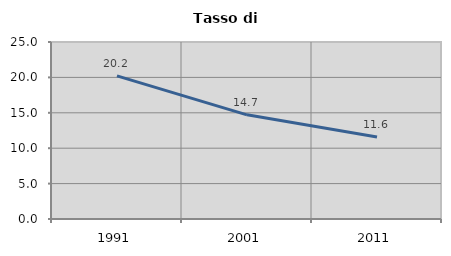
| Category | Tasso di disoccupazione   |
|---|---|
| 1991.0 | 20.22 |
| 2001.0 | 14.712 |
| 2011.0 | 11.57 |